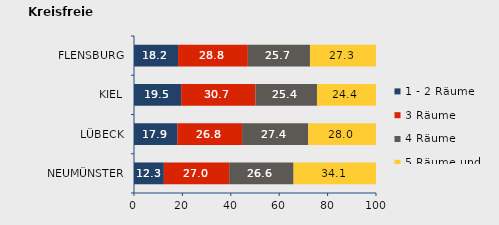
| Category | 1 - 2 Räume | 3 Räume | 4 Räume | 5 Räume und mehr |
|---|---|---|---|---|
| NEUMÜNSTER | 12.345 | 26.989 | 26.607 | 34.058 |
| LÜBECK | 17.91 | 26.75 | 27.362 | 27.978 |
| KIEL | 19.484 | 30.725 | 25.4 | 24.391 |
| FLENSBURG | 18.208 | 28.843 | 25.659 | 27.29 |